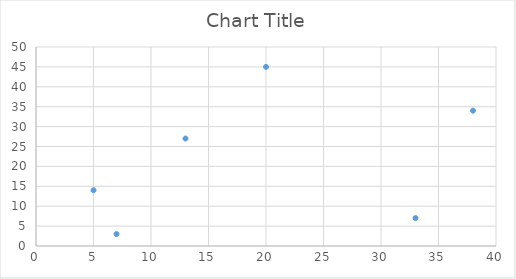
| Category | Series 0 |
|---|---|
| 13.0 | 27 |
| 20.0 | 45 |
| 5.0 | 14 |
| 38.0 | 34 |
| 7.0 | 3 |
| 33.0 | 7 |